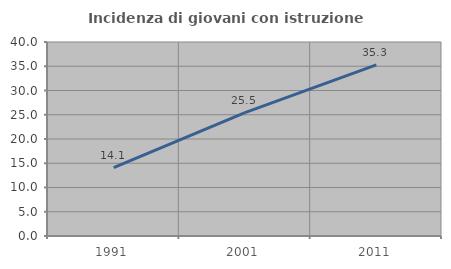
| Category | Incidenza di giovani con istruzione universitaria |
|---|---|
| 1991.0 | 14.103 |
| 2001.0 | 25.455 |
| 2011.0 | 35.294 |